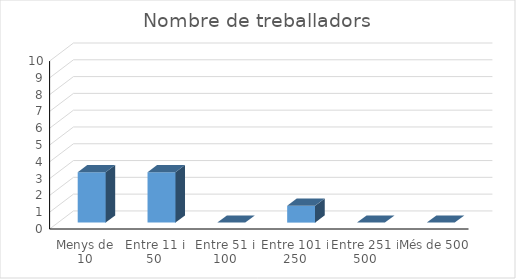
| Category | Series 0 |
|---|---|
| Menys de 10 | 3 |
| Entre 11 i 50 | 3 |
| Entre 51 i 100 | 0 |
| Entre 101 i 250 | 1 |
| Entre 251 i 500 | 0 |
| Més de 500 | 0 |